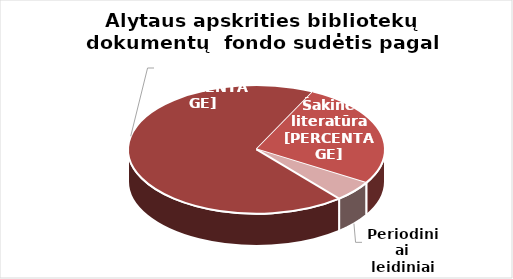
| Category | Series 0 |
|---|---|
| Grožinė literatūra* | 1426439 |
| Šakinė literatūra* | 552075 |
| Periodiniai leidiniai | 107861 |